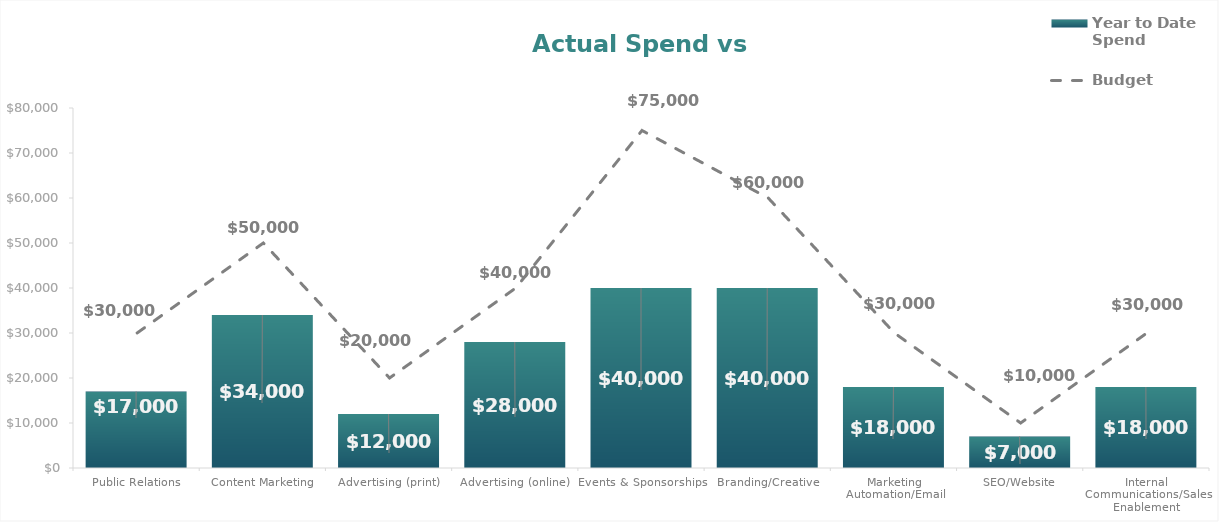
| Category | Year to Date Spend |
|---|---|
| Public Relations | 17000 |
| Content Marketing | 34000 |
| Advertising (print) | 12000 |
| Advertising (online) | 28000 |
| Events & Sponsorships | 40000 |
| Branding/Creative | 40000 |
| Marketing Automation/Email | 18000 |
| SEO/Website | 7000 |
| Internal Communications/Sales Enablement | 18000 |